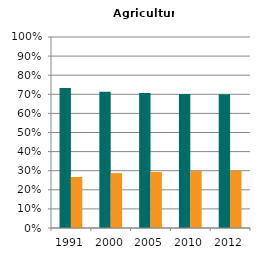
| Category | Male | Female |
|---|---|---|
| 1991.0 | 0.733 | 0.267 |
| 2000.0 | 0.713 | 0.287 |
| 2005.0 | 0.707 | 0.293 |
| 2010.0 | 0.702 | 0.298 |
| 2012.0 | 0.7 | 0.3 |